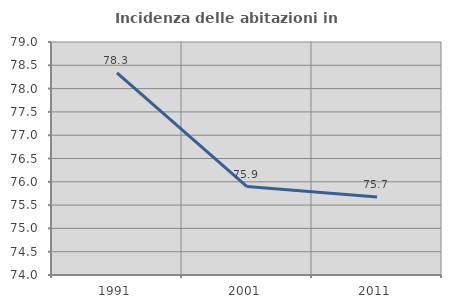
| Category | Incidenza delle abitazioni in proprietà  |
|---|---|
| 1991.0 | 78.337 |
| 2001.0 | 75.897 |
| 2011.0 | 75.674 |